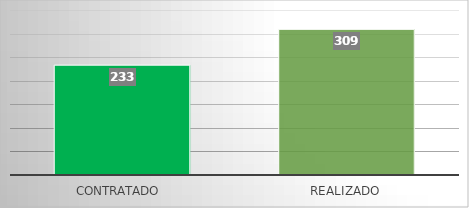
| Category | Series 0 |
|---|---|
| Contratado  | 233 |
| Realizado | 309 |